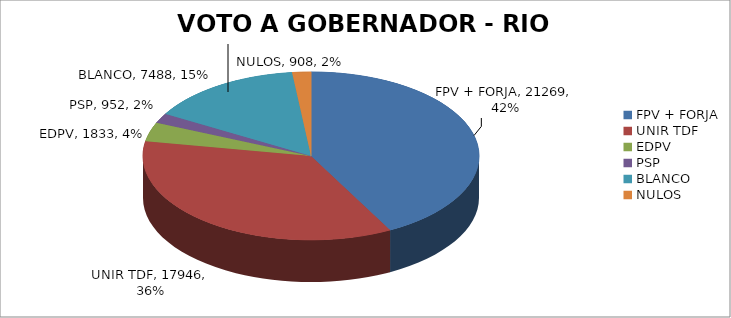
| Category | RIO GRANDE |
|---|---|
| FPV + FORJA | 21269 |
| UNIR TDF | 17946 |
| EDPV | 1833 |
| PSP | 952 |
| BLANCO | 7488 |
| NULOS | 908 |